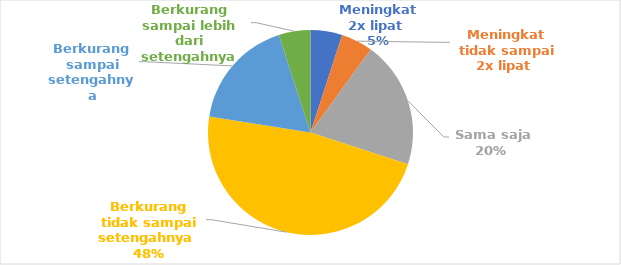
| Category | Hasil Tangkapan Nelayan dalam 10 Tahun Terakhir |
|---|---|
| Meningkat 2x lipat  | 2 |
| Meningkat tidak sampai 2x lipat  | 2 |
|  Sama saja  | 8 |
| Berkurang tidak sampai setengahnya  | 19 |
| Berkurang sampai setengahnya | 7 |
| Berkurang sampai lebih dari setengahnya | 2 |